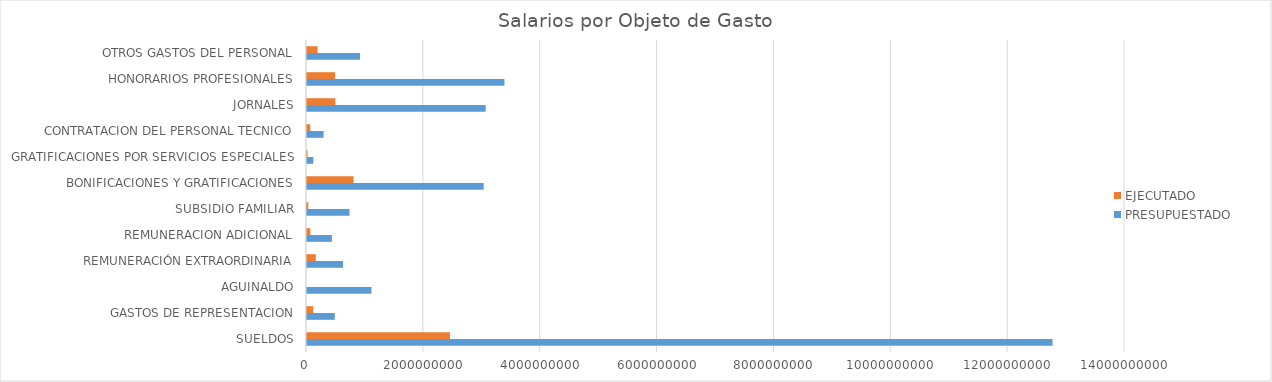
| Category | PRESUPUESTADO | EJECUTADO |
|---|---|---|
| SUELDOS | 12760347408 | 2446956618 |
| GASTOS DE REPRESENTACION | 476214000 | 107998797 |
| AGUINALDO | 1103046784 | 0 |
| REMUNERACIÓN EXTRAORDINARIA | 617333416 | 150121215 |
| REMUNERACION ADICIONAL | 425863008 | 55679938 |
| SUBSIDIO FAMILIAR | 728300000 | 22303916 |
| BONIFICACIONES Y GRATIFICACIONES | 3024010080 | 796549308 |
| GRATIFICACIONES POR SERVICIOS ESPECIALES | 108000000 | 9000000 |
| CONTRATACION DEL PERSONAL TECNICO | 284075000 | 55475000 |
| JORNALES | 3058157615 | 485623426 |
| HONORARIOS PROFESIONALES | 3379469520 | 481324388 |
| OTROS GASTOS DEL PERSONAL | 907314364 | 181175253 |